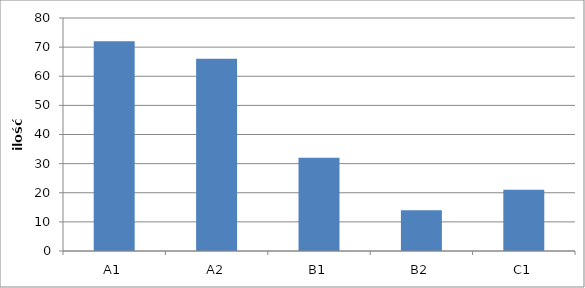
| Category | Series 0 |
|---|---|
| A1 | 72 |
| A2 | 66 |
| B1 | 32 |
| B2 | 14 |
| C1 | 21 |